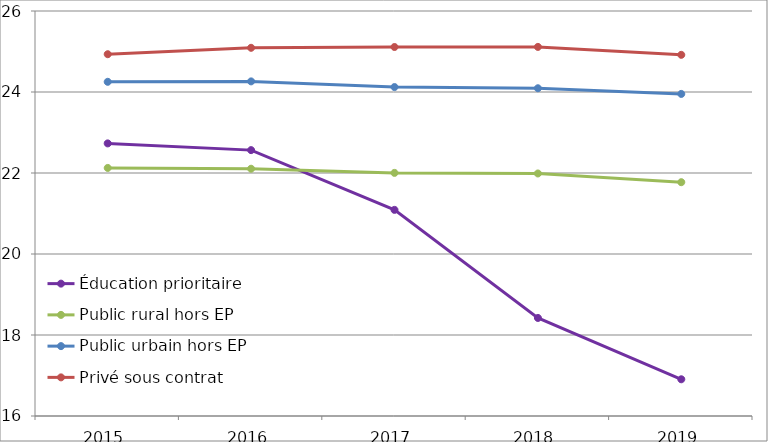
| Category | Éducation prioritaire | Public rural hors EP | Public urbain hors EP | Privé sous contrat |
|---|---|---|---|---|
| 2015.0 | 22.731 | 22.125 | 24.252 | 24.933 |
| 2016.0 | 22.565 | 22.105 | 24.262 | 25.091 |
| 2017.0 | 21.09 | 22.003 | 24.122 | 25.111 |
| 2018.0 | 18.421 | 21.988 | 24.092 | 25.114 |
| 2019.0 | 16.907 | 21.773 | 23.953 | 24.918 |